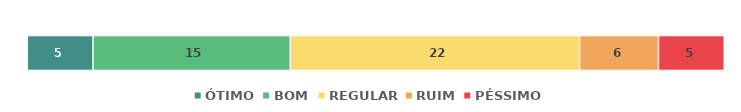
| Category | ÓTIMO | BOM | REGULAR | RUIM | PÉSSIMO |
|---|---|---|---|---|---|
| 0 | 5 | 15 | 22 | 6 | 5 |